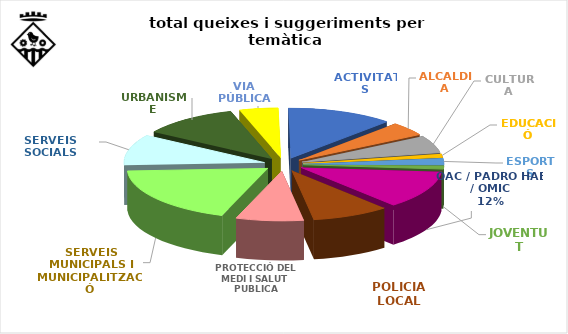
| Category | total | Finalitzades  |
|---|---|---|
| ACTIVITATS | 11 | 8 |
| ALCALDIA | 4 | 1 |
| CULTURA | 5 | 4 |
| EDUCACIÓ | 1 | 0 |
| ESPORTS | 2 | 2 |
| JOVENTUT | 1 | 0 |
| OAC / PADRO HAB / OMIC | 11 | 6 |
| POLICIA LOCAL | 8 | 0 |
| PROTECCIÓ DEL MEDI I SALUT PUBLICA | 7 | 7 |
| SERVEIS MUNICIPALS I MUNICIPALITZACIÓ | 17 | 10 |
| SERVEIS SOCIALS | 9 | 6 |
| URBANISME | 10 | 3 |
| VIA PÚBLICA | 4 | 1 |